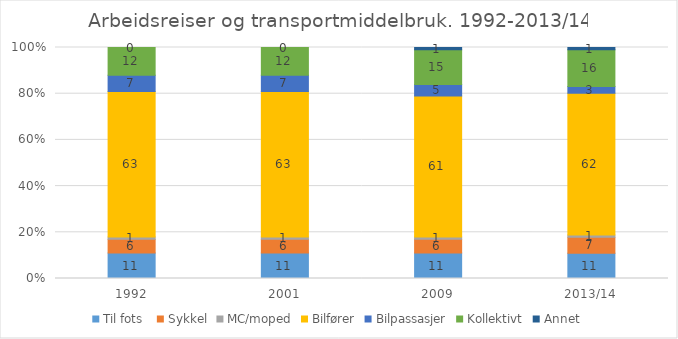
| Category | Til fots  | Sykkel | MC/moped | Bilfører | Bilpassasjer | Kollektivt | Annet |
|---|---|---|---|---|---|---|---|
| 1992 | 11 | 6 | 1 | 63 | 7 | 12 | 0 |
| 2001 | 11 | 6 | 1 | 63 | 7 | 12 | 0 |
| 2009 | 11 | 6 | 1 | 61 | 5 | 15 | 1 |
| 2013/14 | 11 | 7 | 1 | 62 | 3 | 16 | 1 |